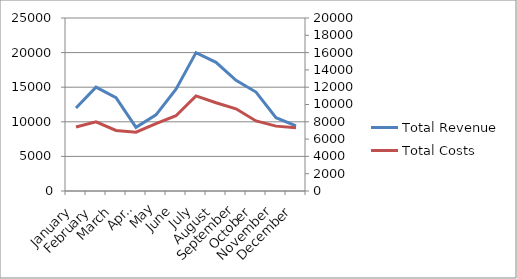
| Category | Total Revenue |
|---|---|
| January | 12000 |
| February | 15000 |
| March | 13500 |
| April | 9200 |
| May | 11000 |
| June | 14700 |
| July | 20000 |
| August | 18600 |
| September | 16000 |
| October | 14300 |
| November | 10600 |
| December | 9400 |